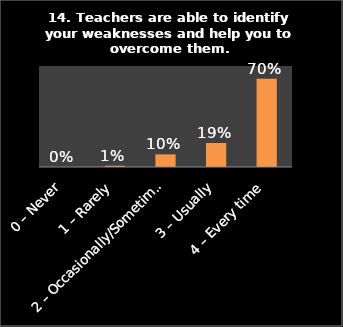
| Category | Series 0 |
|---|---|
| 0 – Never | 0 |
| 1 – Rarely | 0.01 |
| 2 – Occasionally/Sometimes | 0.1 |
| 3 – Usually | 0.19 |
| 4 – Every time | 0.7 |